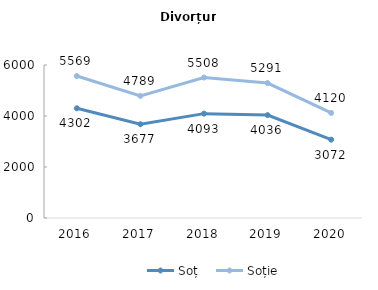
| Category | Soț | Soție |
|---|---|---|
| 2016.0 | 4302 | 5569 |
| 2017.0 | 3677 | 4789 |
| 2018.0 | 4093 | 5508 |
| 2019.0 | 4036 | 5291 |
| 2020.0 | 3072 | 4120 |